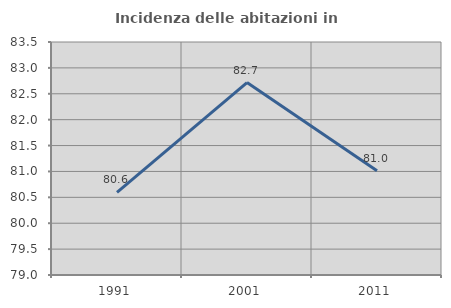
| Category | Incidenza delle abitazioni in proprietà  |
|---|---|
| 1991.0 | 80.597 |
| 2001.0 | 82.716 |
| 2011.0 | 81.013 |